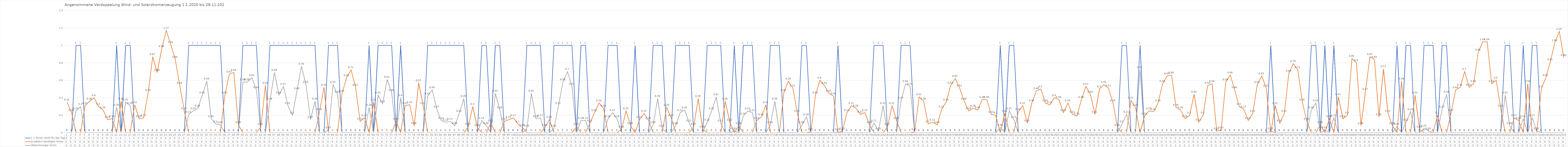
| Category | 1 = Strom reicht für den Tag | Zusätzlich benötigter Strom | Überschüssiger Strom |
|---|---|---|---|
| 0 | 0 | 0.35 | 0 |
| 1 | 0 | 0.23 | 0 |
| 2 | 1 | 0 | 0.25 |
| 3 | 1 | 0 | 0.3 |
| 4 | 0 | 0.31 | 0 |
| 5 | 0 | 0.36 | 0 |
| 6 | 0 | 0.4 | 0 |
| 7 | 0 | 0.3 | 0 |
| 8 | 0 | 0.26 | 0 |
| 9 | 0 | 0.15 | 0 |
| 10 | 0 | 0.16 | 0 |
| 11 | 1 | 0 | 0.29 |
| 12 | 0 | 0.36 | 0 |
| 13 | 1 | 0 | 0.35 |
| 14 | 1 | 0 | 0.31 |
| 15 | 0 | 0.32 | 0 |
| 16 | 0 | 0.16 | 0 |
| 17 | 0 | 0.17 | 0 |
| 18 | 0 | 0.46 | 0 |
| 19 | 0 | 0.87 | 0 |
| 20 | 0 | 0.69 | 0 |
| 21 | 0 | 0.96 | 0 |
| 22 | 0 | 1.17 | 0 |
| 23 | 0 | 1.01 | 0 |
| 24 | 0 | 0.84 | 0 |
| 25 | 0 | 0.54 | 0 |
| 26 | 0 | 0.25 | 0 |
| 27 | 1 | 0 | 0.21 |
| 28 | 1 | 0 | 0.25 |
| 29 | 1 | 0 | 0.28 |
| 30 | 1 | 0 | 0.43 |
| 31 | 1 | 0 | 0.59 |
| 32 | 1 | 0 | 0.16 |
| 33 | 1 | 0 | 0.1 |
| 34 | 1 | 0 | 0.09 |
| 35 | 0 | 0.43 | 0 |
| 36 | 0 | 0.67 | 0 |
| 37 | 0 | 0.69 | 0 |
| 38 | 0 | 0.09 | 0 |
| 39 | 1 | 0 | 0.58 |
| 40 | 1 | 0 | 0.58 |
| 41 | 1 | 0 | 0.63 |
| 42 | 1 | 0 | 0.49 |
| 43 | 0 | 0.07 | 0 |
| 44 | 0 | 0.54 | 0 |
| 45 | 1 | 0 | 0.36 |
| 46 | 1 | 0 | 0.69 |
| 47 | 1 | 0 | 0.43 |
| 48 | 1 | 0 | 0.53 |
| 49 | 1 | 0 | 0.31 |
| 50 | 1 | 0 | 0.2 |
| 51 | 1 | 0 | 0.48 |
| 52 | 1 | 0 | 0.76 |
| 53 | 1 | 0 | 0.55 |
| 54 | 1 | 0 | 0.15 |
| 55 | 1 | 0 | 0.36 |
| 56 | 0 | 0.24 | 0 |
| 57 | 0 | 0.52 | 0 |
| 58 | 1 | 0 | 0.03 |
| 59 | 1 | 0 | 0.55 |
| 60 | 1 | 0 | 0.44 |
| 61 | 0 | 0.45 | 0 |
| 62 | 0 | 0.63 | 0 |
| 63 | 0 | 0.72 | 0 |
| 64 | 0 | 0.52 | 0 |
| 65 | 0 | 0.13 | 0 |
| 66 | 0 | 0.17 | 0 |
| 67 | 1 | 0 | 0.29 |
| 68 | 0 | 0.35 | 0 |
| 69 | 1 | 0 | 0.43 |
| 70 | 1 | 0 | 0.33 |
| 71 | 1 | 0 | 0.61 |
| 72 | 1 | 0 | 0.46 |
| 73 | 0 | 0.13 | 0 |
| 74 | 1 | 0 | 0.4 |
| 75 | 0 | 0.31 | 0 |
| 76 | 0 | 0.32 | 0 |
| 77 | 0 | 0.08 | 0 |
| 78 | 0 | 0.57 | 0 |
| 79 | 0 | 0.31 | 0 |
| 80 | 1 | 0 | 0.42 |
| 81 | 1 | 0 | 0.49 |
| 82 | 1 | 0 | 0.27 |
| 83 | 1 | 0 | 0.14 |
| 84 | 1 | 0 | 0.12 |
| 85 | 1 | 0 | 0.13 |
| 86 | 1 | 0 | 0.08 |
| 87 | 1 | 0 | 0.22 |
| 88 | 1 | 0 | 0.39 |
| 89 | 0 | 0.07 | 0 |
| 90 | 0 | 0.3 | 0 |
| 91 | 0 | 0.06 | 0 |
| 92 | 1 | 0 | 0.14 |
| 93 | 1 | 0 | 0.08 |
| 94 | 0 | 0.11 | 0 |
| 95 | 1 | 0 | 0.45 |
| 96 | 1 | 0 | 0.26 |
| 97 | 0 | 0.13 | 0 |
| 98 | 0 | 0.15 | 0 |
| 99 | 0 | 0.17 | 0 |
| 100 | 0 | 0.1 | 0 |
| 101 | 0 | 0.06 | 0 |
| 102 | 1 | 0 | 0.05 |
| 103 | 1 | 0 | 0.45 |
| 104 | 1 | 0 | 0.16 |
| 105 | 1 | 0 | 0.17 |
| 106 | 0 | 0.06 | 0 |
| 107 | 0 | 0.15 | 0 |
| 108 | 1 | 0 | 0.05 |
| 109 | 1 | 0 | 0.31 |
| 110 | 1 | 0 | 0.58 |
| 111 | 1 | 0 | 0.7 |
| 112 | 1 | 0 | 0.53 |
| 113 | 0 | 0.07 | 0 |
| 114 | 1 | 0 | 0.14 |
| 115 | 1 | 0 | 0.14 |
| 116 | 0 | 0.11 | 0 |
| 117 | 0 | 0.23 | 0 |
| 118 | 0 | 0.34 | 0 |
| 119 | 0 | 0.28 | 0 |
| 120 | 1 | 0 | 0.16 |
| 121 | 1 | 0 | 0.23 |
| 122 | 1 | 0 | 0.16 |
| 123 | 0 | 0.04 | 0 |
| 124 | 0 | 0.25 | 0 |
| 125 | 0 | 0.08 | 0 |
| 126 | 1 | 0 | 0 |
| 127 | 0 | 0.15 | 0 |
| 128 | 0 | 0.22 | 0 |
| 129 | 0 | 0.14 | 0 |
| 130 | 1 | 0 | 0.09 |
| 131 | 1 | 0 | 0.39 |
| 132 | 1 | 0 | 0.05 |
| 133 | 0 | 0.29 | 0 |
| 134 | 0 | 0.17 | 0 |
| 135 | 1 | 0 | 0.08 |
| 136 | 1 | 0 | 0.23 |
| 137 | 1 | 0 | 0.26 |
| 138 | 1 | 0 | 0.11 |
| 139 | 0 | 0.07 | 0 |
| 140 | 0 | 0.39 | 0 |
| 141 | 0 | 0.04 | 0 |
| 142 | 1 | 0 | 0.12 |
| 143 | 1 | 0 | 0.25 |
| 144 | 1 | 0 | 0.41 |
| 145 | 1 | 0 | 0.11 |
| 146 | 0 | 0.36 | 0 |
| 147 | 0 | 0.12 | 0 |
| 148 | 1 | 0 | 0.02 |
| 149 | 0 | 0.08 | 0 |
| 150 | 1 | 0 | 0.19 |
| 151 | 1 | 0 | 0.25 |
| 152 | 1 | 0 | 0.23 |
| 153 | 0 | 0.14 | 0 |
| 154 | 0 | 0.18 | 0 |
| 155 | 0 | 0.32 | 0 |
| 156 | 1 | 0 | 0.09 |
| 157 | 1 | 0 | 0.36 |
| 158 | 1 | 0 | 0 |
| 159 | 0 | 0.46 | 0 |
| 160 | 0 | 0.59 | 0 |
| 161 | 0 | 0.51 | 0 |
| 162 | 0 | 0.22 | 0 |
| 163 | 1 | 0 | 0.09 |
| 164 | 1 | 0 | 0.18 |
| 165 | 0 | 0.01 | 0 |
| 166 | 0 | 0.43 | 0 |
| 167 | 0 | 0.6 | 0 |
| 168 | 0 | 0.54 | 0 |
| 169 | 0 | 0.45 | 0 |
| 170 | 0 | 0.42 | 0 |
| 171 | 1 | 0 | 0.01 |
| 172 | 0 | 0.02 | 0 |
| 173 | 0 | 0.23 | 0 |
| 174 | 0 | 0.31 | 0 |
| 175 | 0 | 0.28 | 0 |
| 176 | 0 | 0.21 | 0 |
| 177 | 0 | 0.23 | 0 |
| 178 | 0 | 0.09 | 0 |
| 179 | 1 | 0 | 0.11 |
| 180 | 1 | 0 | 0.02 |
| 181 | 1 | 0 | 0.31 |
| 182 | 0 | 0.07 | 0 |
| 183 | 0 | 0.31 | 0 |
| 184 | 0 | 0.14 | 0 |
| 185 | 1 | 0 | 0.37 |
| 186 | 1 | 0 | 0.56 |
| 187 | 1 | 0 | 0.53 |
| 188 | 0 | 0.01 | 0 |
| 189 | 0 | 0.41 | 0 |
| 190 | 0 | 0.36 | 0 |
| 191 | 0 | 0.1 | 0 |
| 192 | 0 | 0.12 | 0 |
| 193 | 0 | 0.09 | 0 |
| 194 | 0 | 0.27 | 0 |
| 195 | 0 | 0.35 | 0 |
| 196 | 0 | 0.54 | 0 |
| 197 | 0 | 0.62 | 0 |
| 198 | 0 | 0.51 | 0 |
| 199 | 0 | 0.36 | 0 |
| 200 | 0 | 0.25 | 0 |
| 201 | 0 | 0.28 | 0 |
| 202 | 0 | 0.26 | 0 |
| 203 | 0 | 0.38 | 0 |
| 204 | 0 | 0.38 | 0 |
| 205 | 0 | 0.21 | 0 |
| 206 | 0 | 0.2 | 0 |
| 207 | 1 | 0 | 0.06 |
| 208 | 0 | 0.22 | 0 |
| 209 | 1 | 0 | 0.25 |
| 210 | 1 | 0 | 0.15 |
| 211 | 0 | 0.24 | 0 |
| 212 | 0 | 0.31 | 0 |
| 213 | 0 | 0.11 | 0 |
| 214 | 0 | 0.34 | 0 |
| 215 | 0 | 0.48 | 0 |
| 216 | 0 | 0.5 | 0 |
| 217 | 0 | 0.34 | 0 |
| 218 | 0 | 0.32 | 0 |
| 219 | 0 | 0.4 | 0 |
| 220 | 0 | 0.38 | 0 |
| 221 | 0 | 0.23 | 0 |
| 222 | 0 | 0.34 | 0 |
| 223 | 0 | 0.21 | 0 |
| 224 | 0 | 0.19 | 0 |
| 225 | 0 | 0.38 | 0 |
| 226 | 0 | 0.53 | 0 |
| 227 | 0 | 0.44 | 0 |
| 228 | 0 | 0.21 | 0 |
| 229 | 0 | 0.5 | 0 |
| 230 | 0 | 0.55 | 0 |
| 231 | 0 | 0.51 | 0 |
| 232 | 0 | 0.34 | 0 |
| 233 | 0 | 0.06 | 0 |
| 234 | 1 | 0 | 0.1 |
| 235 | 1 | 0 | 0.21 |
| 236 | 0 | 0.37 | 0 |
| 237 | 0 | 0.29 | 0 |
| 238 | 1 | 0 | 0.72 |
| 239 | 0 | 0.19 | 0 |
| 240 | 0 | 0.25 | 0 |
| 241 | 0 | 0.24 | 0 |
| 242 | 0 | 0.34 | 0 |
| 243 | 0 | 0.56 | 0 |
| 244 | 0 | 0.65 | 0 |
| 245 | 0 | 0.66 | 0 |
| 246 | 0 | 0.29 | 0 |
| 247 | 0 | 0.26 | 0 |
| 248 | 0 | 0.16 | 0 |
| 249 | 0 | 0.2 | 0 |
| 250 | 0 | 0.44 | 0 |
| 251 | 0 | 0.12 | 0 |
| 252 | 0 | 0.2 | 0 |
| 253 | 0 | 0.54 | 0 |
| 254 | 0 | 0.56 | 0 |
| 255 | 0 | 0.02 | 0 |
| 256 | 0 | 0.03 | 0 |
| 257 | 0 | 0.58 | 0 |
| 258 | 0 | 0.66 | 0 |
| 259 | 0 | 0.49 | 0 |
| 260 | 0 | 0.3 | 0 |
| 261 | 0 | 0.27 | 0 |
| 262 | 0 | 0.14 | 0 |
| 263 | 0 | 0.22 | 0 |
| 264 | 0 | 0.55 | 0 |
| 265 | 0 | 0.65 | 0 |
| 266 | 0 | 0.51 | 0 |
| 267 | 1 | 0 | 0.02 |
| 268 | 0 | 0.31 | 0 |
| 269 | 0 | 0.11 | 0 |
| 270 | 0 | 0.22 | 0 |
| 271 | 0 | 0.68 | 0 |
| 272 | 0 | 0.79 | 0 |
| 273 | 0 | 0.72 | 0 |
| 274 | 0 | 0.35 | 0 |
| 275 | 0 | 0.13 | 0 |
| 276 | 1 | 0 | 0.26 |
| 277 | 1 | 0 | 0.34 |
| 278 | 0 | 0.09 | 0 |
| 279 | 1 | 0 | 0.03 |
| 280 | 0 | 0.16 | 0 |
| 281 | 1 | 0 | 0.17 |
| 282 | 0 | 0.41 | 0 |
| 283 | 0 | 0.16 | 0 |
| 284 | 0 | 0.2 | 0 |
| 285 | 0 | 0.85 | 0 |
| 286 | 0 | 0.8 | 0 |
| 287 | 0 | 0.08 | 0 |
| 288 | 0 | 0.47 | 0 |
| 289 | 0 | 0.87 | 0 |
| 290 | 0 | 0.84 | 0 |
| 291 | 0 | 0.18 | 0 |
| 292 | 0 | 0.73 | 0 |
| 293 | 0 | 0.22 | 0 |
| 294 | 0 | 0.08 | 0 |
| 295 | 1 | 0 | 0.07 |
| 296 | 0 | 0.59 | 0 |
| 297 | 1 | 0 | 0.12 |
| 298 | 1 | 0 | 0.24 |
| 299 | 0 | 0.43 | 0 |
| 300 | 0 | 0.04 | 0 |
| 301 | 1 | 0 | 0.05 |
| 302 | 1 | 0 | 0.02 |
| 303 | 1 | 0 | 0 |
| 304 | 0 | 0.2 | 0 |
| 305 | 1 | 0 | 0.27 |
| 306 | 1 | 0 | 0.44 |
| 307 | 0 | 0.23 | 0 |
| 308 | 0 | 0.49 | 0 |
| 309 | 0 | 0.52 | 0 |
| 310 | 0 | 0.7 | 0 |
| 311 | 0 | 0.52 | 0 |
| 312 | 0 | 0.56 | 0 |
| 313 | 0 | 0.92 | 0 |
| 314 | 0 | 1.04 | 0 |
| 315 | 0 | 1.04 | 0 |
| 316 | 0 | 0.56 | 0 |
| 317 | 0 | 0.6 | 0 |
| 318 | 0 | 0.28 | 0 |
| 319 | 1 | 0 | 0.43 |
| 320 | 1 | 0 | 0.08 |
| 321 | 0 | 0.17 | 0 |
| 322 | 0 | 0.14 | 0 |
| 323 | 1 | 0 | 0.16 |
| 324 | 0 | 0.56 | 0 |
| 325 | 1 | 0 | 0.17 |
| 326 | 1 | 0 | 0.02 |
| 327 | 0 | 0.5 | 0 |
| 328 | 0 | 0.63 | 0 |
| 329 | 0 | 0.81 | 0 |
| 330 | 0 | 1.03 | 0 |
| 331 | 0 | 1.16 | 0 |
| 332 | 0 | 0.86 | 0 |